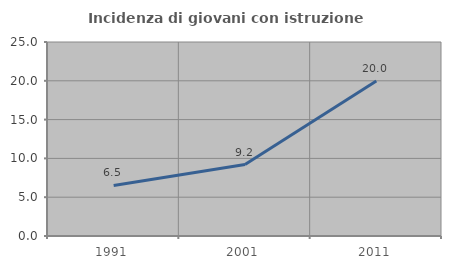
| Category | Incidenza di giovani con istruzione universitaria |
|---|---|
| 1991.0 | 6.509 |
| 2001.0 | 9.213 |
| 2011.0 | 19.961 |